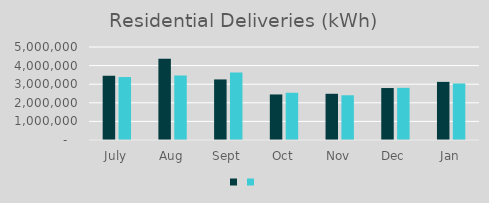
| Category | Series 1 | Series 0 |
|---|---|---|
| July | 3456641 | 3385366 |
| Aug | 4364840 | 3470448 |
| Sept | 3255766 | 3631455 |
| Oct | 2448610 | 2538922 |
| Nov | 2484917 | 2405818 |
| Dec | 2793607 | 2803771 |
| Jan | 3124442 | 3040217 |